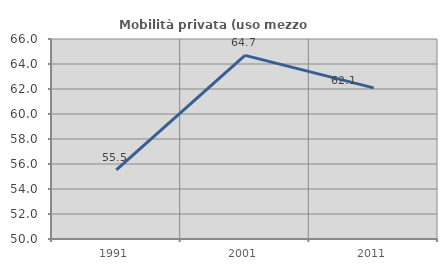
| Category | Mobilità privata (uso mezzo privato) |
|---|---|
| 1991.0 | 55.535 |
| 2001.0 | 64.688 |
| 2011.0 | 62.088 |